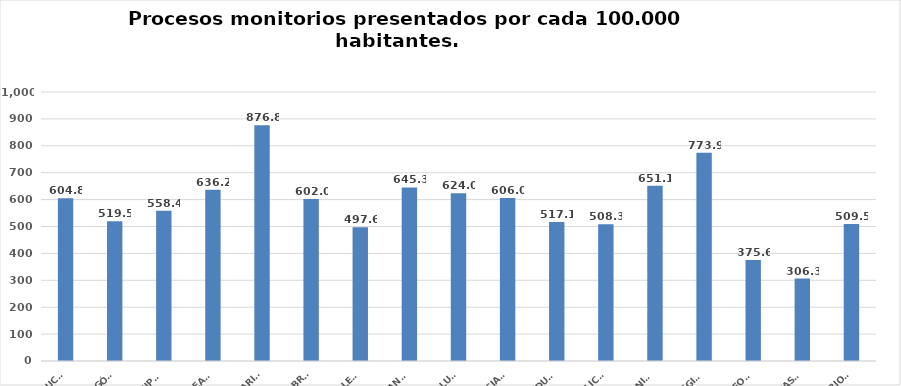
| Category | Series 0 |
|---|---|
| ANDALUCÍA | 604.827 |
| ARAGÓN | 519.518 |
| ASTURIAS, PRINCIPADO | 558.412 |
| ILLES BALEARS | 636.184 |
| CANARIAS | 876.766 |
| CANTABRIA | 602.009 |
| CASTILLA - LEÓN | 497.616 |
| CASTILLA - LA MANCHA | 645.335 |
| CATALUÑA | 624.049 |
| C. VALENCIANA | 605.986 |
| EXTREMADURA | 517.118 |
| GALICIA | 508.35 |
| MADRID, COMUNIDAD | 651.077 |
| MURCIA, REGIÓN | 773.949 |
| NAVARRA, COM. FORAL | 375.632 |
| PAÍS VASCO | 306.274 |
| LA RIOJA | 509.522 |